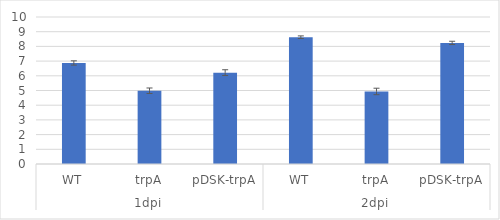
| Category | Series 0 |
|---|---|
| 0 | 6.872 |
| 1 | 4.984 |
| 2 | 6.214 |
| 3 | 8.625 |
| 4 | 4.936 |
| 5 | 8.238 |